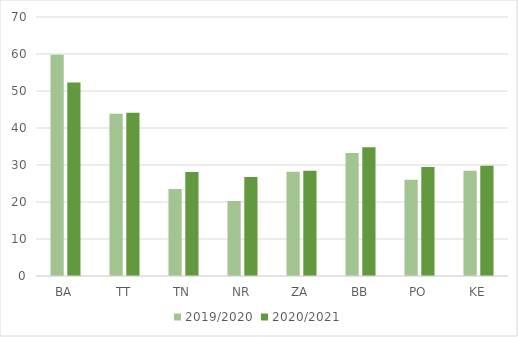
| Category | 2019/2020 | 2020/2021 |
|---|---|---|
| BA | 59.815 | 52.297 |
| TT | 43.822 | 44.13 |
| TN | 23.509 | 28.101 |
| NR | 20.242 | 26.773 |
| ZA | 28.201 | 28.414 |
| BB | 33.242 | 34.808 |
| PO | 26.012 | 29.442 |
| KE | 28.479 | 29.794 |